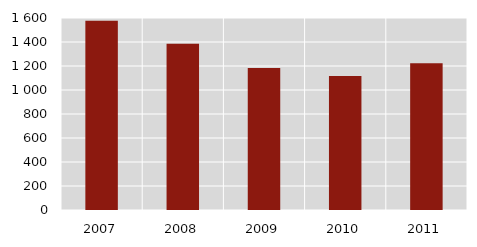
| Category | Series 0 |
|---|---|
| 2007 | 1577 |
| 2008 | 1386 |
| 2009 | 1184 |
| 2010 | 1116 |
| 2011 | 1222 |